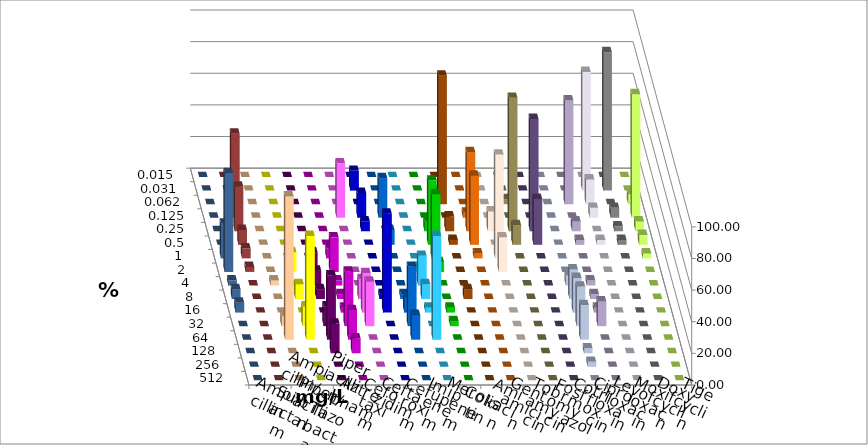
| Category | Ampicillin | Ampicillin/ Sulbactam | Piperacillin | Piperacillin/ Tazobactam | Aztreonam | Cefotaxim | Ceftazidim | Cefuroxim | Imipenem | Meropenem | Colistin | Amikacin | Gentamicin | Tobramycin | Fosfomycin | Cotrimoxazol | Ciprofloxacin | Levofloxacin | Moxifloxacin | Doxycyclin | Tigecyclin |
|---|---|---|---|---|---|---|---|---|---|---|---|---|---|---|---|---|---|---|---|---|---|
| 0.015 | 0 | 0 | 0 | 0 | 0 | 0 | 0 | 0 | 0 | 0 | 0 | 0 | 0 | 0 | 0 | 0 | 0 | 0 | 0 | 0 | 0 |
| 0.031 | 0 | 0 | 0 | 0 | 0 | 12.5 | 0 | 0 | 0 | 0 | 0 | 0 | 0 | 0 | 0 | 0 | 75 | 87.5 | 0 | 0 | 0 |
| 0.062 | 0 | 0 | 0 | 0 | 0 | 0 | 0 | 0 | 0 | 81.25 | 0 | 0 | 3.125 | 0 | 0 | 65.625 | 15.625 | 0 | 6.25 | 0 | 0 |
| 0.125 | 0 | 0 | 0 | 0 | 34.375 | 15.625 | 25 | 0 | 0 | 0 | 3.125 | 0 | 0 | 0 | 0 | 0 | 6.25 | 6.25 | 78.125 | 0 | 53.125 |
| 0.25 | 0 | 0 | 0 | 0 | 0 | 6.25 | 0 | 0 | 6.25 | 9.375 | 50 | 12.5 | 84.375 | 70.968 | 0 | 6.25 | 0 | 3.125 | 6.25 | 0 | 28.125 |
| 0.5 | 0 | 0 | 0 | 0 | 0 | 0 | 9.375 | 0 | 40.625 | 3.125 | 43.75 | 0 | 12.5 | 29.032 | 0 | 3.125 | 3.125 | 3.125 | 6.25 | 0 | 9.375 |
| 1.0 | 0 | 0 | 0 | 6.25 | 0 | 0 | 0 | 0 | 40.625 | 0 | 3.125 | 65.625 | 0 | 0 | 0 | 0 | 0 | 0 | 3.125 | 21.875 | 6.25 |
| 2.0 | 0 | 12.5 | 12.5 | 21.875 | 0 | 0 | 0 | 3.125 | 6.25 | 0 | 0 | 21.875 | 0 | 0 | 0 | 0 | 0 | 0 | 0 | 62.5 | 3.125 |
| 4.0 | 3.125 | 0 | 9.375 | 3.125 | 0 | 0 | 0 | 18.75 | 0 | 0 | 0 | 0 | 0 | 0 | 6.25 | 3.125 | 0 | 0 | 0 | 3.125 | 0 |
| 8.0 | 0 | 9.375 | 6.25 | 3.125 | 12.5 | 3.125 | 3.125 | 9.375 | 0 | 6.25 | 0 | 0 | 0 | 0 | 18.75 | 3.125 | 0 | 0 | 0 | 6.25 | 0 |
| 16.0 | 0 | 0 | 0 | 3.125 | 25 | 62.5 | 9.375 | 3.125 | 3.125 | 0 | 0 | 0 | 0 | 0 | 21.875 | 3.125 | 0 | 0 | 0 | 6.25 | 0 |
| 32.0 | 6.25 | 12.5 | 12.5 | 34.375 | 28.125 | 0 | 37.5 | 0 | 3.125 | 0 | 0 | 0 | 0 | 0 | 25 | 15.625 | 0 | 0 | 0 | 0 | 0 |
| 64.0 | 90.625 | 65.625 | 40.625 | 18.75 | 0 | 0 | 15.625 | 65.625 | 0 | 0 | 0 | 0 | 0 | 0 | 21.875 | 0 | 0 | 0 | 0 | 0 | 0 |
| 128.0 | 0 | 0 | 18.75 | 9.375 | 0 | 0 | 0 | 0 | 0 | 0 | 0 | 0 | 0 | 0 | 3.125 | 0 | 0 | 0 | 0 | 0 | 0 |
| 256.0 | 0 | 0 | 0 | 0 | 0 | 0 | 0 | 0 | 0 | 0 | 0 | 0 | 0 | 0 | 3.125 | 0 | 0 | 0 | 0 | 0 | 0 |
| 512.0 | 0 | 0 | 0 | 0 | 0 | 0 | 0 | 0 | 0 | 0 | 0 | 0 | 0 | 0 | 0 | 0 | 0 | 0 | 0 | 0 | 0 |